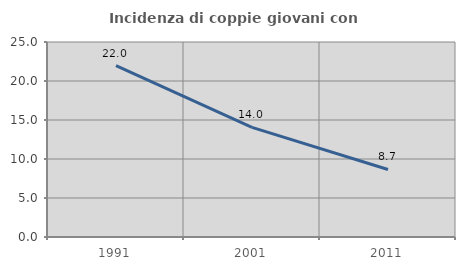
| Category | Incidenza di coppie giovani con figli |
|---|---|
| 1991.0 | 21.983 |
| 2001.0 | 14.05 |
| 2011.0 | 8.657 |